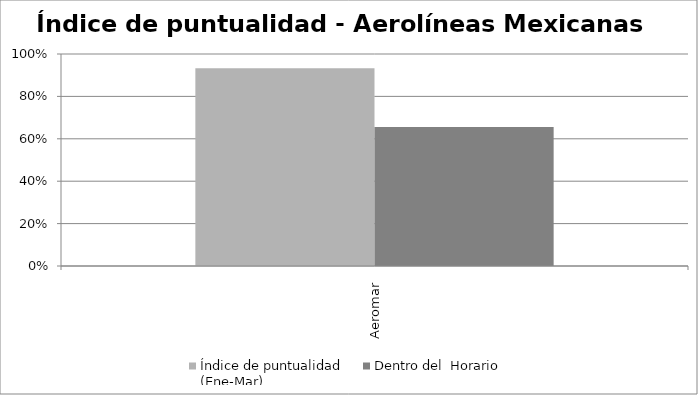
| Category | Índice de puntualidad
(Ene-Mar) | Dentro del  Horario |
|---|---|---|
| Aeromar | 0.933 | 0.656 |